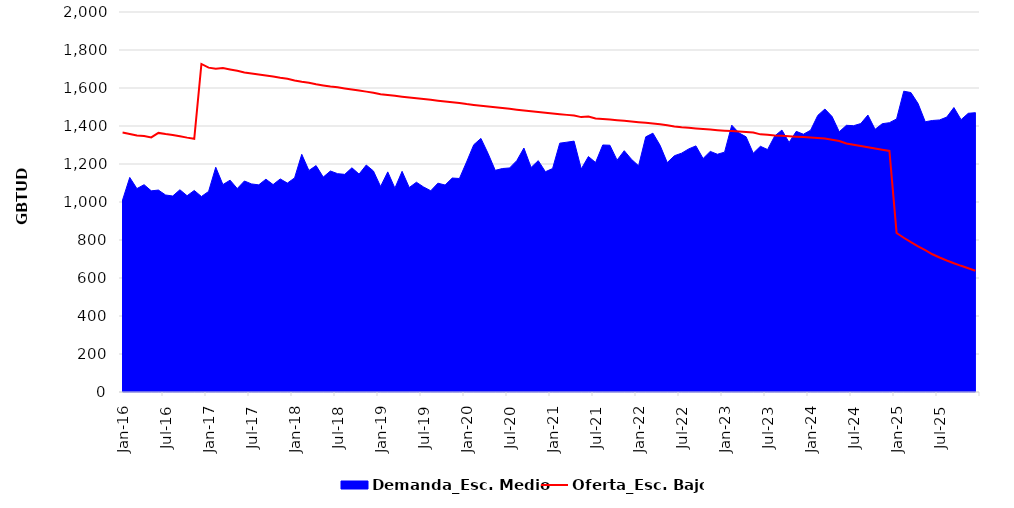
| Category | Oferta_Esc. Bajo |
|---|---|
| 2016-01-01 | 1365.693 |
| 2016-02-01 | 1358.267 |
| 2016-03-01 | 1350.549 |
| 2016-04-01 | 1347.158 |
| 2016-05-01 | 1339.854 |
| 2016-06-01 | 1363.695 |
| 2016-07-01 | 1357.741 |
| 2016-08-01 | 1353.09 |
| 2016-09-01 | 1346.079 |
| 2016-10-01 | 1338.836 |
| 2016-11-01 | 1332.486 |
| 2016-12-01 | 1726.471 |
| 2017-01-01 | 1707.163 |
| 2017-02-01 | 1700.984 |
| 2017-03-01 | 1704.718 |
| 2017-04-01 | 1697.699 |
| 2017-05-01 | 1691.052 |
| 2017-06-01 | 1681.768 |
| 2017-07-01 | 1676.092 |
| 2017-08-01 | 1670.654 |
| 2017-09-01 | 1665.238 |
| 2017-10-01 | 1660.23 |
| 2017-11-01 | 1653.994 |
| 2017-12-01 | 1648.843 |
| 2018-01-01 | 1639.068 |
| 2018-02-01 | 1632.718 |
| 2018-03-01 | 1627.565 |
| 2018-04-01 | 1619.289 |
| 2018-05-01 | 1613.269 |
| 2018-06-01 | 1607.79 |
| 2018-07-01 | 1603.65 |
| 2018-08-01 | 1597.871 |
| 2018-09-01 | 1592.141 |
| 2018-10-01 | 1586.587 |
| 2018-11-01 | 1580.884 |
| 2018-12-01 | 1575.392 |
| 2019-01-01 | 1567.264 |
| 2019-02-01 | 1562.763 |
| 2019-03-01 | 1559.067 |
| 2019-04-01 | 1554.416 |
| 2019-05-01 | 1550.133 |
| 2019-06-01 | 1546.041 |
| 2019-07-01 | 1541.779 |
| 2019-08-01 | 1537.772 |
| 2019-09-01 | 1533.512 |
| 2019-10-01 | 1529.458 |
| 2019-11-01 | 1525.175 |
| 2019-12-01 | 1521.034 |
| 2020-01-01 | 1515.288 |
| 2020-02-01 | 1510.868 |
| 2020-03-01 | 1507.008 |
| 2020-04-01 | 1503.063 |
| 2020-05-01 | 1498.637 |
| 2020-06-01 | 1494.262 |
| 2020-07-01 | 1490.217 |
| 2020-08-01 | 1485.741 |
| 2020-09-01 | 1481.575 |
| 2020-10-01 | 1477.267 |
| 2020-11-01 | 1473.17 |
| 2020-12-01 | 1469.192 |
| 2021-01-01 | 1465.62 |
| 2021-02-01 | 1461.996 |
| 2021-03-01 | 1458.564 |
| 2021-04-01 | 1454.876 |
| 2021-05-01 | 1446.791 |
| 2021-06-01 | 1449.361 |
| 2021-07-01 | 1440.042 |
| 2021-08-01 | 1436.883 |
| 2021-09-01 | 1433.808 |
| 2021-10-01 | 1430.679 |
| 2021-11-01 | 1427.455 |
| 2021-12-01 | 1424.299 |
| 2022-01-01 | 1420.201 |
| 2022-02-01 | 1416.563 |
| 2022-03-01 | 1413.079 |
| 2022-04-01 | 1409.548 |
| 2022-05-01 | 1403.727 |
| 2022-06-01 | 1397.955 |
| 2022-07-01 | 1393.486 |
| 2022-08-01 | 1390.24 |
| 2022-09-01 | 1387.076 |
| 2022-10-01 | 1383.992 |
| 2022-11-01 | 1380.987 |
| 2022-12-01 | 1377.999 |
| 2023-01-01 | 1375.464 |
| 2023-02-01 | 1373.064 |
| 2023-03-01 | 1370.779 |
| 2023-04-01 | 1368.483 |
| 2023-05-01 | 1366.2 |
| 2023-06-01 | 1355.944 |
| 2023-07-01 | 1353.752 |
| 2023-08-01 | 1350.232 |
| 2023-09-01 | 1348.075 |
| 2023-10-01 | 1345.982 |
| 2023-11-01 | 1343.924 |
| 2023-12-01 | 1341.895 |
| 2024-01-01 | 1339.198 |
| 2024-02-01 | 1336.474 |
| 2024-03-01 | 1333.849 |
| 2024-04-01 | 1327.339 |
| 2024-05-01 | 1321.038 |
| 2024-06-01 | 1307.677 |
| 2024-07-01 | 1301.736 |
| 2024-08-01 | 1294.783 |
| 2024-09-01 | 1288.039 |
| 2024-10-01 | 1281.48 |
| 2024-11-01 | 1275.07 |
| 2024-12-01 | 1268.855 |
| 2025-01-01 | 837.044 |
| 2025-02-01 | 811.734 |
| 2025-03-01 | 788.486 |
| 2025-04-01 | 767.008 |
| 2025-05-01 | 747.191 |
| 2025-06-01 | 724.805 |
| 2025-07-01 | 707.894 |
| 2025-08-01 | 692.212 |
| 2025-09-01 | 677.625 |
| 2025-10-01 | 664.112 |
| 2025-11-01 | 651.541 |
| 2025-12-01 | 638.36 |